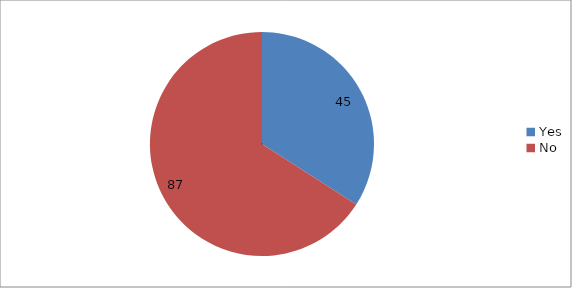
| Category | Series 0 |
|---|---|
| Yes | 45 |
| No | 87 |